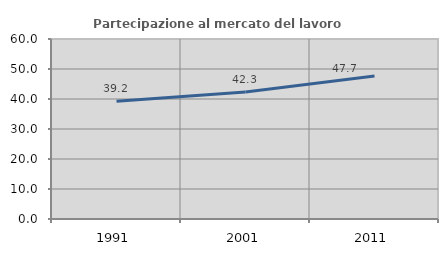
| Category | Partecipazione al mercato del lavoro  femminile |
|---|---|
| 1991.0 | 39.212 |
| 2001.0 | 42.305 |
| 2011.0 | 47.671 |